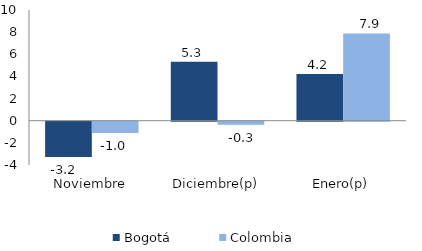
| Category | Bogotá | Colombia |
|---|---|---|
| Noviembre | -3.184 | -1.026 |
| Diciembre(p) | 5.316 | -0.285 |
| Enero(p) | 4.208 | 7.886 |